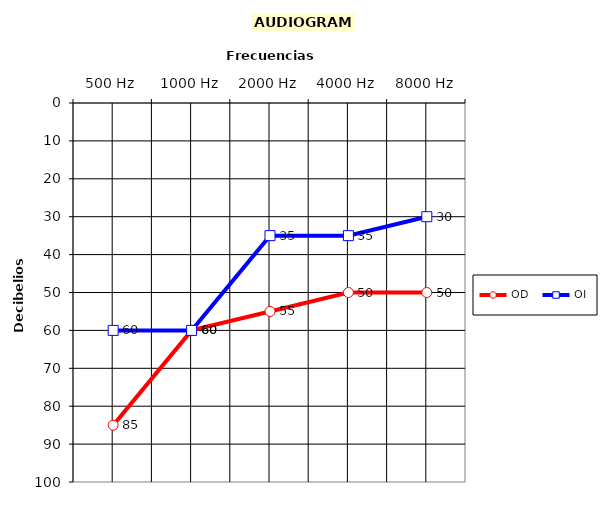
| Category | OD | OI |
|---|---|---|
| 500 Hz | 85 | 60 |
| 1000 Hz | 60 | 60 |
| 2000 Hz | 55 | 35 |
| 4000 Hz | 50 | 35 |
| 8000 Hz | 50 | 30 |